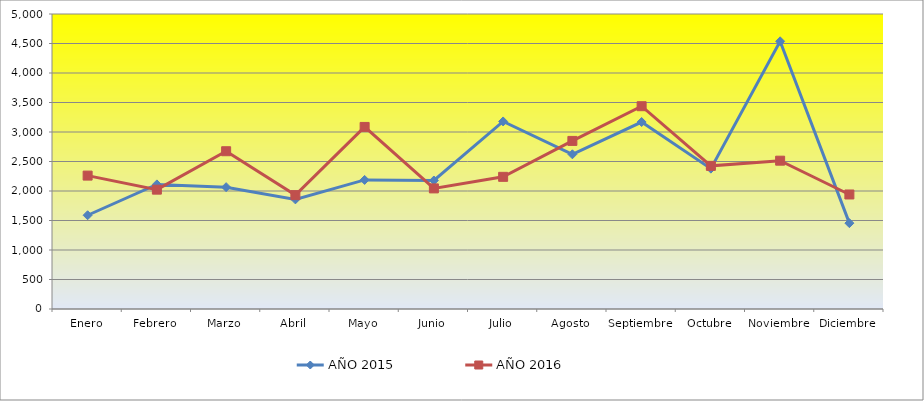
| Category | AÑO 2015 | AÑO 2016 |
|---|---|---|
| Enero | 1589 | 2261 |
| Febrero | 2112 | 2023 |
| Marzo | 2065 | 2674 |
| Abril | 1858 | 1930 |
| Mayo | 2188 | 3086 |
| Junio | 2178 | 2044 |
| Julio | 3179 | 2240 |
| Agosto | 2622 | 2849 |
| Septiembre | 3169 | 3437 |
| Octubre | 2379 | 2426 |
| Noviembre | 4537 | 2514 |
| Diciembre | 1455 | 1941 |